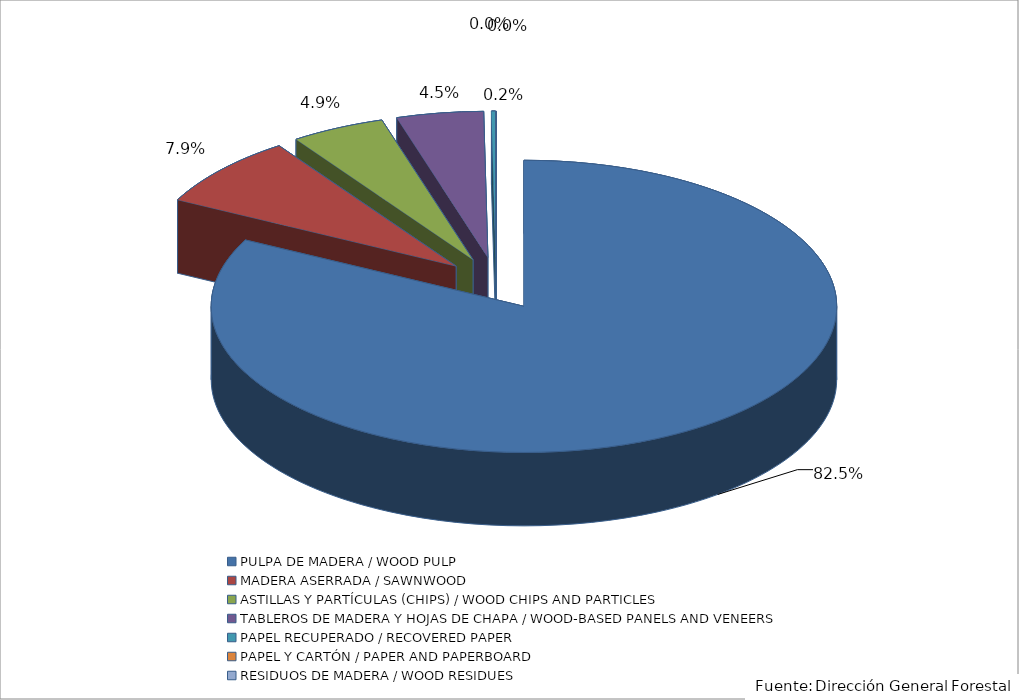
| Category | Series 0 |
|---|---|
| PULPA DE MADERA / WOOD PULP | 1913547.624 |
| MADERA ASERRADA / SAWNWOOD | 183534.317 |
| ASTILLAS Y PARTÍCULAS (CHIPS) / WOOD CHIPS AND PARTICLES | 112950.73 |
| TABLEROS DE MADERA Y HOJAS DE CHAPA / WOOD-BASED PANELS AND VENEERS | 104103.177 |
| PAPEL RECUPERADO / RECOVERED PAPER | 4839.057 |
| PAPEL Y CARTÓN / PAPER AND PAPERBOARD | 247.817 |
| RESIDUOS DE MADERA / WOOD RESIDUES | 0 |